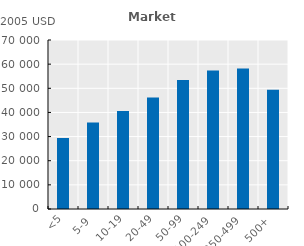
| Category | Series 0 |
|---|---|
| <5 | 29406.771 |
| 5-9 | 35850.326 |
| 10-19 | 40567.767 |
| 20-49 | 46154.287 |
| 50-99 | 53400.171 |
| 100-249 | 57324.788 |
| 250-499 | 58148.054 |
| 500+ | 49413.028 |